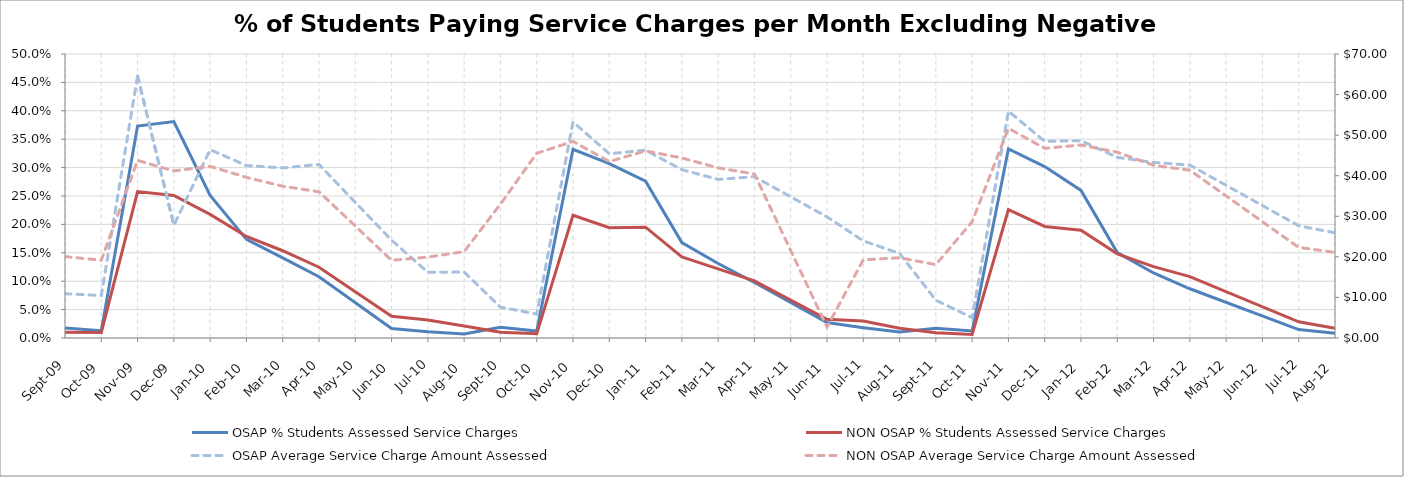
| Category | OSAP % Students Assessed Service Charges | NON OSAP % Students Assessed Service Charges |
|---|---|---|
| 2009-09-01 | 0.017 | 0.01 |
| 2009-10-01 | 0.013 | 0.01 |
| 2009-11-01 | 0.373 | 0.258 |
| 2009-12-01 | 0.381 | 0.251 |
| 2010-01-01 | 0.251 | 0.218 |
| 2010-02-01 | 0.174 | 0.179 |
| 2010-03-01 | 0.141 | 0.154 |
| 2010-04-01 | 0.108 | 0.125 |
| 2010-06-01 | 0.017 | 0.038 |
| 2010-07-01 | 0.011 | 0.032 |
| 2010-08-01 | 0.007 | 0.021 |
| 2010-09-01 | 0.019 | 0.01 |
| 2010-10-01 | 0.012 | 0.007 |
| 2010-11-01 | 0.332 | 0.216 |
| 2010-12-01 | 0.307 | 0.194 |
| 2011-01-01 | 0.276 | 0.195 |
| 2011-02-01 | 0.168 | 0.143 |
| 2011-03-01 | 0.131 | 0.122 |
| 2011-04-01 | 0.098 | 0.101 |
| 2011-06-01 | 0.027 | 0.033 |
| 2011-07-01 | 0.018 | 0.03 |
| 2011-08-01 | 0.011 | 0.017 |
| 2011-09-01 | 0.017 | 0.009 |
| 2011-10-01 | 0.012 | 0.006 |
| 2011-11-01 | 0.333 | 0.226 |
| 2011-12-01 | 0.302 | 0.196 |
| 2012-01-01 | 0.26 | 0.19 |
| 2012-02-01 | 0.15 | 0.148 |
| 2012-03-01 | 0.115 | 0.126 |
| 2012-04-01 | 0.087 | 0.108 |
| 2012-07-01 | 0.015 | 0.029 |
| 2012-08-01 | 0.008 | 0.017 |